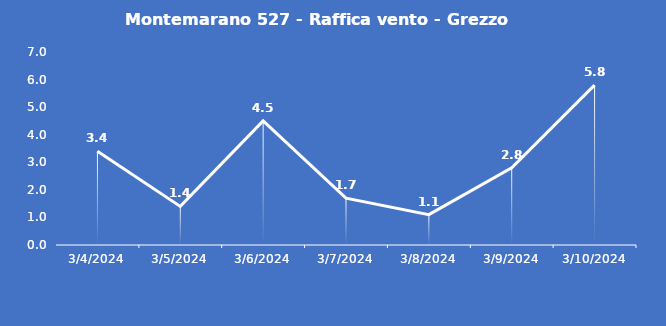
| Category | Montemarano 527 - Raffica vento - Grezzo (m/s) |
|---|---|
| 3/4/24 | 3.4 |
| 3/5/24 | 1.4 |
| 3/6/24 | 4.5 |
| 3/7/24 | 1.7 |
| 3/8/24 | 1.1 |
| 3/9/24 | 2.8 |
| 3/10/24 | 5.8 |